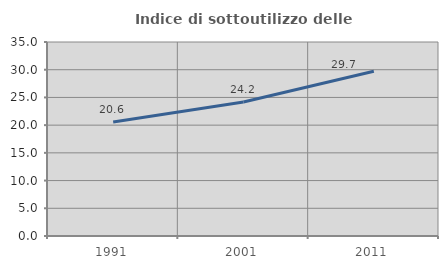
| Category | Indice di sottoutilizzo delle abitazioni  |
|---|---|
| 1991.0 | 20.554 |
| 2001.0 | 24.173 |
| 2011.0 | 29.73 |